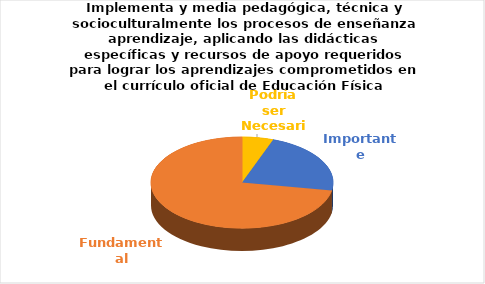
| Category | Series 0 |
|---|---|
| Podría ser Necesaria | 1 |
| Importante | 4 |
| Fundamental | 13 |